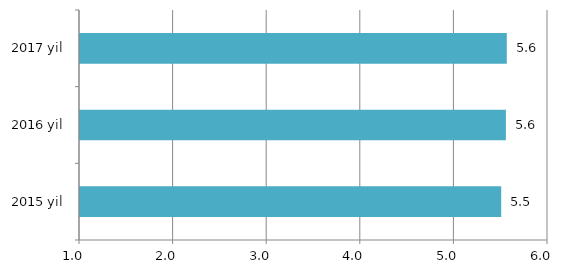
| Category | Series 0 |
|---|---|
| 2015 yil | 5.5 |
| 2016 yil | 5.55 |
| 2017 yil | 5.56 |